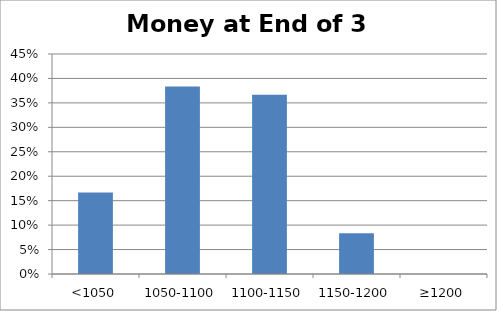
| Category | Probability |
|---|---|
| <1050 | 0.167 |
| 1050-1100 | 0.383 |
| 1100-1150 | 0.367 |
| 1150-1200 | 0.083 |
| ≥1200 | 0 |